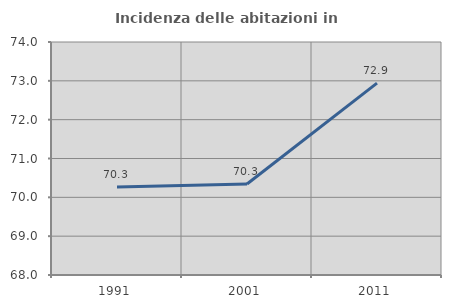
| Category | Incidenza delle abitazioni in proprietà  |
|---|---|
| 1991.0 | 70.269 |
| 2001.0 | 70.342 |
| 2011.0 | 72.941 |